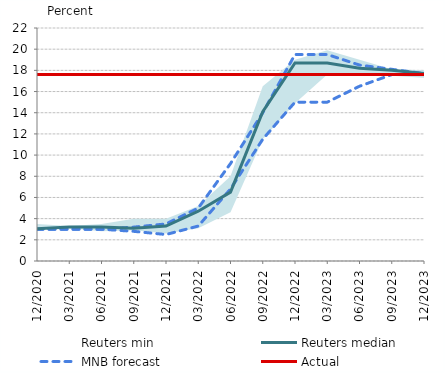
| Category | MNB forecast | Reuters median |
|---|---|---|
| 2020-12-01 | 3 | 3.05 |
| 2021-03-01 | 3 | 3.2 |
| 2021-06-01 | 3 | 3.2 |
| 2021-09-01 | 3.2 | 3.1 |
| 2021-12-01 | 3.5 | 3.3 |
| 2022-03-01 | 5 | 4.7 |
| 2022-06-01 | 9.2 | 6.5 |
| 2022-09-01 | 14 | 14.1 |
| 2022-12-01 | 19.5 | 18.7 |
| 2023-03-01 | 19.5 | 18.7 |
| 2023-06-01 | 18.5 | 18.2 |
| 2023-09-01 | 18.1 | 18 |
| 2023-12-01 | 17.7 | 17.7 |